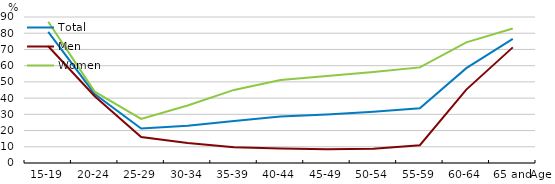
| Category | Total | Men | Women |
|---|---|---|---|
| 15-19 | 80.769 | 72 | 87.037 |
| 20-24 | 42.558 | 41.121 | 43.981 |
| 25-29 | 21.308 | 16.014 | 27.165 |
| 30-34 | 23.017 | 12.367 | 35.47 |
| 35-39 | 25.893 | 9.772 | 45.059 |
| 40-44 | 28.734 | 8.869 | 51.211 |
| 45-49 | 29.931 | 8.421 | 53.623 |
| 50-54 | 31.609 | 8.84 | 56.119 |
| 55-59 | 33.755 | 10.997 | 58.935 |
| 60-64 | 58.469 | 45.259 | 74.372 |
| 65 and over | 76.56 | 71.28 | 82.917 |